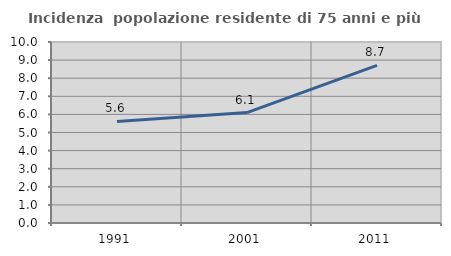
| Category | Incidenza  popolazione residente di 75 anni e più |
|---|---|
| 1991.0 | 5.613 |
| 2001.0 | 6.103 |
| 2011.0 | 8.713 |